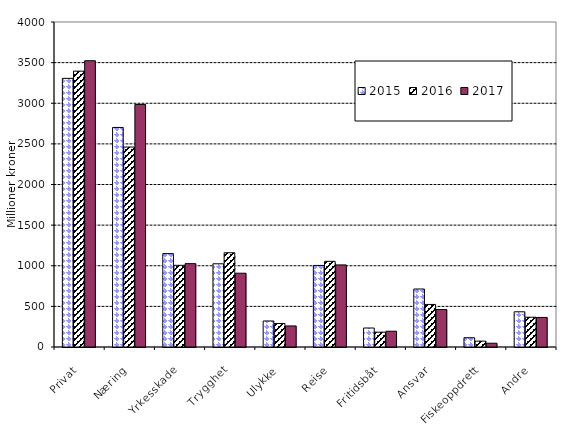
| Category | 2015 | 2016 | 2017 |
|---|---|---|---|
| Privat | 3306.181 | 3395.008 | 3523.339 |
| Næring | 2701.946 | 2460.812 | 2985.487 |
| Yrkesskade | 1149.454 | 1005.194 | 1025.826 |
| Trygghet | 1024.114 | 1159.859 | 908.118 |
| Ulykke | 320.227 | 289.644 | 259.137 |
| Reise | 1003.721 | 1054.352 | 1010.192 |
| Fritidsbåt | 233.83 | 182.688 | 194.097 |
| Ansvar | 713.799 | 523.92 | 461.433 |
| Fiskeoppdrett | 114.061 | 72.478 | 46.489 |
| Andre | 433.39 | 366.614 | 363.98 |